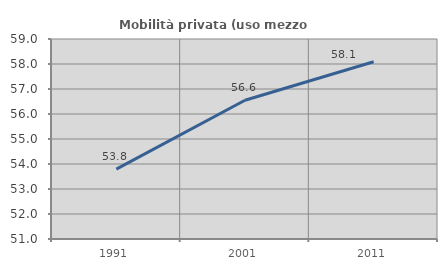
| Category | Mobilità privata (uso mezzo privato) |
|---|---|
| 1991.0 | 53.795 |
| 2001.0 | 56.552 |
| 2011.0 | 58.09 |